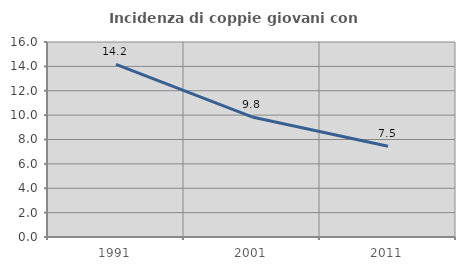
| Category | Incidenza di coppie giovani con figli |
|---|---|
| 1991.0 | 14.172 |
| 2001.0 | 9.849 |
| 2011.0 | 7.451 |